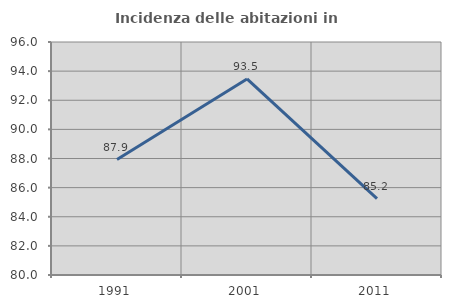
| Category | Incidenza delle abitazioni in proprietà  |
|---|---|
| 1991.0 | 87.931 |
| 2001.0 | 93.462 |
| 2011.0 | 85.246 |